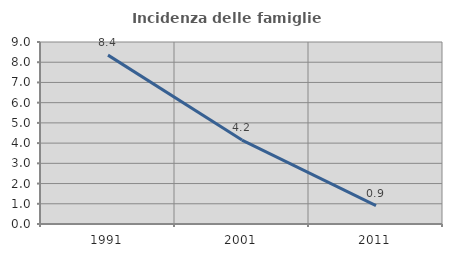
| Category | Incidenza delle famiglie numerose |
|---|---|
| 1991.0 | 8.351 |
| 2001.0 | 4.15 |
| 2011.0 | 0.912 |